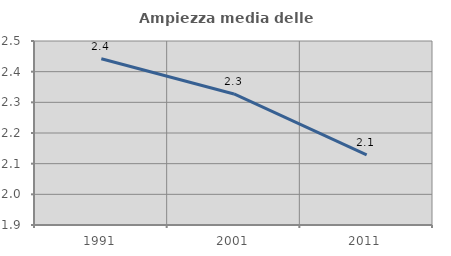
| Category | Ampiezza media delle famiglie |
|---|---|
| 1991.0 | 2.442 |
| 2001.0 | 2.327 |
| 2011.0 | 2.129 |